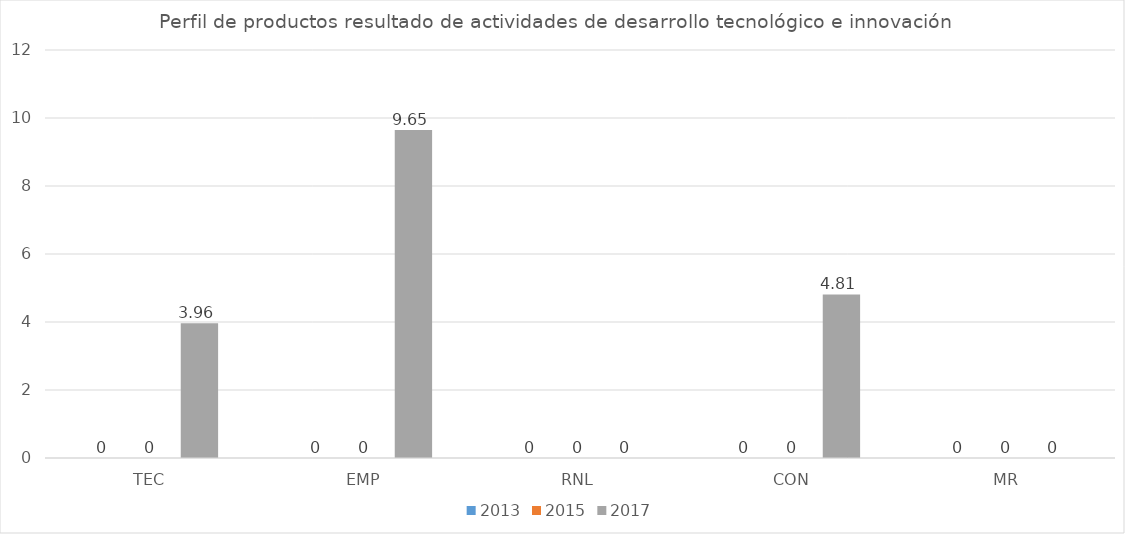
| Category | 2013 | 2015 | 2017 |
|---|---|---|---|
| TEC | 0 | 0 | 3.96 |
| EMP | 0 | 0 | 9.65 |
| RNL | 0 | 0 | 0 |
| CON | 0 | 0 | 4.81 |
| MR | 0 | 0 | 0 |